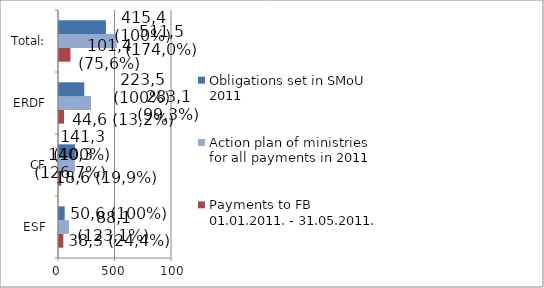
| Category | Payments to FB 01.01.2011. - 31.05.2011.  | Action plan of ministries for all payments in 2011 | Obligations set in SMoU 2011 | Saprašanās memorandā noteikto saistību izpilde / Implementation of SMoU in 2011, %  | 2011.gada maija AI mērķis / Target for May 2011 | Series 4 | 2011.gada maija AI mērķa izpilde / Reaching the target for May 2011  |
|---|---|---|---|---|---|---|---|
| ESF | 38252272.5 | 88065460.81 | 50601888 |  |  |  |  |
| CF | 18615140.59 | 140323266.06 | 141263604 |  |  |  |  |
| ERDF | 44580440.611 | 283119254.293 | 223491672 |  |  |  |  |
| Total: | 101447853.701 | 511507981.163 | 415357164 |  |  |  |  |